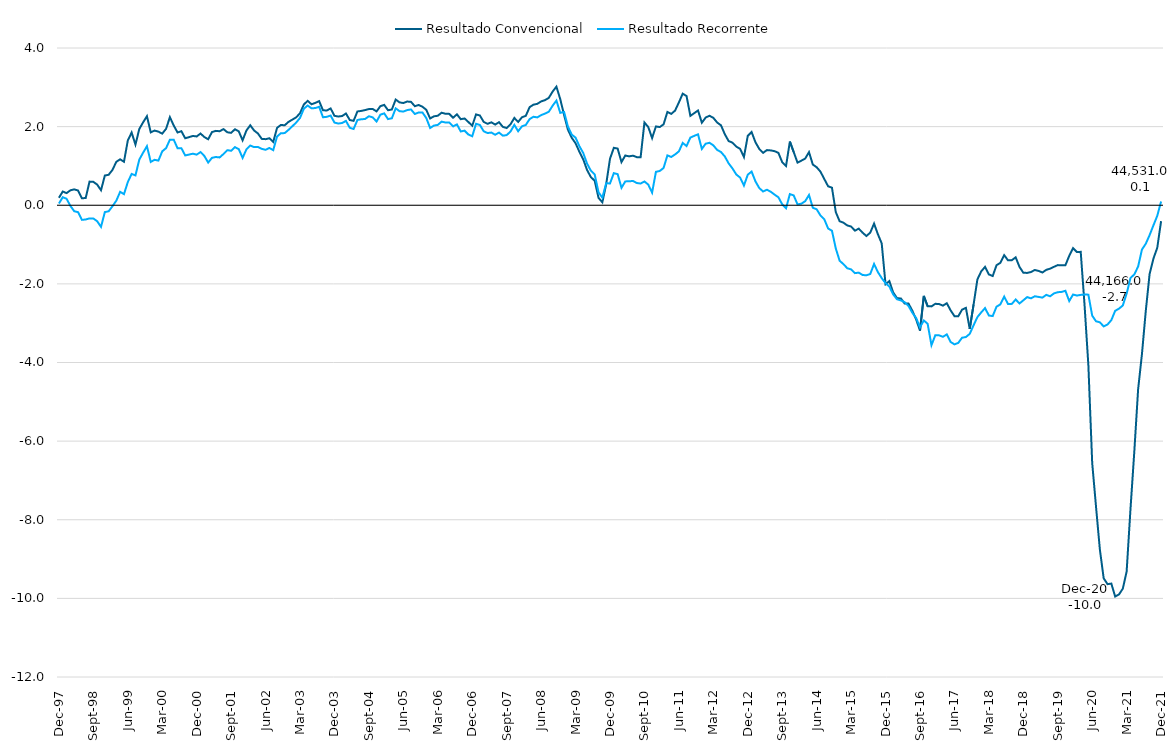
| Category | Resultado Convencional | Resultado Recorrente |
|---|---|---|
| 1997-12-01 | 0.189 | 0.044 |
| 1998-01-01 | 0.349 | 0.204 |
| 1998-02-01 | 0.309 | 0.165 |
| 1998-03-01 | 0.38 | -0.016 |
| 1998-04-01 | 0.404 | -0.152 |
| 1998-05-01 | 0.376 | -0.176 |
| 1998-06-01 | 0.177 | -0.372 |
| 1998-07-01 | 0.184 | -0.362 |
| 1998-08-01 | 0.601 | -0.334 |
| 1998-09-01 | 0.595 | -0.337 |
| 1998-10-01 | 0.525 | -0.407 |
| 1998-11-01 | 0.382 | -0.55 |
| 1998-12-01 | 0.756 | -0.174 |
| 1999-01-01 | 0.776 | -0.153 |
| 1999-02-01 | 0.9 | -0.024 |
| 1999-03-01 | 1.105 | 0.116 |
| 1999-04-01 | 1.168 | 0.341 |
| 1999-05-01 | 1.106 | 0.282 |
| 1999-06-01 | 1.646 | 0.589 |
| 1999-07-01 | 1.85 | 0.797 |
| 1999-08-01 | 1.542 | 0.759 |
| 1999-09-01 | 1.939 | 1.16 |
| 1999-10-01 | 2.109 | 1.337 |
| 1999-11-01 | 2.265 | 1.502 |
| 1999-12-01 | 1.854 | 1.102 |
| 2000-01-01 | 1.9 | 1.156 |
| 2000-02-01 | 1.873 | 1.136 |
| 2000-03-01 | 1.822 | 1.372 |
| 2000-04-01 | 1.944 | 1.453 |
| 2000-05-01 | 2.241 | 1.667 |
| 2000-06-01 | 2.029 | 1.668 |
| 2000-07-01 | 1.85 | 1.45 |
| 2000-08-01 | 1.884 | 1.452 |
| 2000-09-01 | 1.704 | 1.267 |
| 2000-10-01 | 1.732 | 1.289 |
| 2000-11-01 | 1.763 | 1.312 |
| 2000-12-01 | 1.75 | 1.288 |
| 2001-01-01 | 1.824 | 1.352 |
| 2001-02-01 | 1.735 | 1.255 |
| 2001-03-01 | 1.678 | 1.086 |
| 2001-04-01 | 1.862 | 1.206 |
| 2001-05-01 | 1.892 | 1.227 |
| 2001-06-01 | 1.883 | 1.216 |
| 2001-07-01 | 1.937 | 1.303 |
| 2001-08-01 | 1.856 | 1.401 |
| 2001-09-01 | 1.842 | 1.386 |
| 2001-10-01 | 1.933 | 1.478 |
| 2001-11-01 | 1.879 | 1.426 |
| 2001-12-01 | 1.652 | 1.203 |
| 2002-01-01 | 1.902 | 1.422 |
| 2002-02-01 | 2.034 | 1.519 |
| 2002-03-01 | 1.902 | 1.479 |
| 2002-04-01 | 1.826 | 1.482 |
| 2002-05-01 | 1.688 | 1.434 |
| 2002-06-01 | 1.681 | 1.411 |
| 2002-07-01 | 1.704 | 1.457 |
| 2002-08-01 | 1.611 | 1.401 |
| 2002-09-01 | 1.968 | 1.749 |
| 2002-10-01 | 2.043 | 1.831 |
| 2002-11-01 | 2.034 | 1.836 |
| 2002-12-01 | 2.121 | 1.918 |
| 2003-01-01 | 2.178 | 2.01 |
| 2003-02-01 | 2.236 | 2.104 |
| 2003-03-01 | 2.342 | 2.221 |
| 2003-04-01 | 2.563 | 2.455 |
| 2003-05-01 | 2.656 | 2.536 |
| 2003-06-01 | 2.569 | 2.465 |
| 2003-07-01 | 2.604 | 2.473 |
| 2003-08-01 | 2.649 | 2.505 |
| 2003-09-01 | 2.416 | 2.239 |
| 2003-10-01 | 2.411 | 2.249 |
| 2003-11-01 | 2.463 | 2.281 |
| 2003-12-01 | 2.275 | 2.104 |
| 2004-01-01 | 2.257 | 2.078 |
| 2004-02-01 | 2.269 | 2.092 |
| 2004-03-01 | 2.335 | 2.146 |
| 2004-04-01 | 2.168 | 1.971 |
| 2004-05-01 | 2.147 | 1.94 |
| 2004-06-01 | 2.386 | 2.169 |
| 2004-07-01 | 2.399 | 2.187 |
| 2004-08-01 | 2.421 | 2.194 |
| 2004-09-01 | 2.447 | 2.264 |
| 2004-10-01 | 2.448 | 2.235 |
| 2004-11-01 | 2.387 | 2.13 |
| 2004-12-01 | 2.52 | 2.304 |
| 2005-01-01 | 2.553 | 2.337 |
| 2005-02-01 | 2.416 | 2.192 |
| 2005-03-01 | 2.436 | 2.213 |
| 2005-04-01 | 2.689 | 2.464 |
| 2005-05-01 | 2.617 | 2.394 |
| 2005-06-01 | 2.6 | 2.382 |
| 2005-07-01 | 2.638 | 2.421 |
| 2005-08-01 | 2.63 | 2.437 |
| 2005-09-01 | 2.52 | 2.322 |
| 2005-10-01 | 2.55 | 2.36 |
| 2005-11-01 | 2.506 | 2.359 |
| 2005-12-01 | 2.427 | 2.217 |
| 2006-01-01 | 2.207 | 1.965 |
| 2006-02-01 | 2.262 | 2.027 |
| 2006-03-01 | 2.277 | 2.044 |
| 2006-04-01 | 2.354 | 2.127 |
| 2006-05-01 | 2.327 | 2.104 |
| 2006-06-01 | 2.324 | 2.103 |
| 2006-07-01 | 2.227 | 2.005 |
| 2006-08-01 | 2.313 | 2.057 |
| 2006-09-01 | 2.189 | 1.877 |
| 2006-10-01 | 2.207 | 1.898 |
| 2006-11-01 | 2.117 | 1.799 |
| 2006-12-01 | 2.023 | 1.756 |
| 2007-01-01 | 2.311 | 2.072 |
| 2007-02-01 | 2.283 | 2.042 |
| 2007-03-01 | 2.12 | 1.882 |
| 2007-04-01 | 2.071 | 1.837 |
| 2007-05-01 | 2.11 | 1.849 |
| 2007-06-01 | 2.052 | 1.793 |
| 2007-07-01 | 2.113 | 1.849 |
| 2007-08-01 | 1.993 | 1.77 |
| 2007-09-01 | 1.964 | 1.784 |
| 2007-10-01 | 2.058 | 1.875 |
| 2007-11-01 | 2.22 | 2.044 |
| 2007-12-01 | 2.119 | 1.883 |
| 2008-01-01 | 2.238 | 2.008 |
| 2008-02-01 | 2.275 | 2.043 |
| 2008-03-01 | 2.496 | 2.192 |
| 2008-04-01 | 2.559 | 2.25 |
| 2008-05-01 | 2.579 | 2.234 |
| 2008-06-01 | 2.641 | 2.293 |
| 2008-07-01 | 2.674 | 2.331 |
| 2008-08-01 | 2.73 | 2.378 |
| 2008-09-01 | 2.891 | 2.531 |
| 2008-10-01 | 3.017 | 2.662 |
| 2008-11-01 | 2.7 | 2.351 |
| 2008-12-01 | 2.297 | 2.374 |
| 2009-01-01 | 1.924 | 2.003 |
| 2009-02-01 | 1.715 | 1.797 |
| 2009-03-01 | 1.577 | 1.72 |
| 2009-04-01 | 1.361 | 1.503 |
| 2009-05-01 | 1.169 | 1.33 |
| 2009-06-01 | 0.897 | 1.061 |
| 2009-07-01 | 0.716 | 0.879 |
| 2009-08-01 | 0.623 | 0.785 |
| 2009-09-01 | 0.188 | 0.329 |
| 2009-10-01 | 0.075 | 0.194 |
| 2009-11-01 | 0.533 | 0.559 |
| 2009-12-01 | 1.183 | 0.555 |
| 2010-01-01 | 1.461 | 0.817 |
| 2010-02-01 | 1.441 | 0.791 |
| 2010-03-01 | 1.097 | 0.444 |
| 2010-04-01 | 1.266 | 0.607 |
| 2010-05-01 | 1.243 | 0.609 |
| 2010-06-01 | 1.262 | 0.619 |
| 2010-07-01 | 1.224 | 0.565 |
| 2010-08-01 | 1.22 | 0.553 |
| 2010-09-01 | 2.105 | 0.604 |
| 2010-10-01 | 1.989 | 0.525 |
| 2010-11-01 | 1.709 | 0.322 |
| 2010-12-01 | 2.004 | 0.85 |
| 2011-01-01 | 1.989 | 0.871 |
| 2011-02-01 | 2.058 | 0.948 |
| 2011-03-01 | 2.373 | 1.268 |
| 2011-04-01 | 2.324 | 1.228 |
| 2011-05-01 | 2.407 | 1.292 |
| 2011-06-01 | 2.615 | 1.37 |
| 2011-07-01 | 2.838 | 1.585 |
| 2011-08-01 | 2.779 | 1.506 |
| 2011-09-01 | 2.274 | 1.721 |
| 2011-10-01 | 2.342 | 1.765 |
| 2011-11-01 | 2.41 | 1.804 |
| 2011-12-01 | 2.1 | 1.433 |
| 2012-01-01 | 2.231 | 1.566 |
| 2012-02-01 | 2.277 | 1.588 |
| 2012-03-01 | 2.223 | 1.523 |
| 2012-04-01 | 2.105 | 1.408 |
| 2012-05-01 | 2.033 | 1.353 |
| 2012-06-01 | 1.807 | 1.242 |
| 2012-07-01 | 1.632 | 1.066 |
| 2012-08-01 | 1.592 | 0.937 |
| 2012-09-01 | 1.491 | 0.783 |
| 2012-10-01 | 1.435 | 0.704 |
| 2012-11-01 | 1.227 | 0.501 |
| 2012-12-01 | 1.765 | 0.777 |
| 2013-01-01 | 1.862 | 0.857 |
| 2013-02-01 | 1.604 | 0.609 |
| 2013-03-01 | 1.433 | 0.438 |
| 2013-04-01 | 1.332 | 0.35 |
| 2013-05-01 | 1.403 | 0.394 |
| 2013-06-01 | 1.395 | 0.344 |
| 2013-07-01 | 1.376 | 0.271 |
| 2013-08-01 | 1.333 | 0.203 |
| 2013-09-01 | 1.095 | 0.024 |
| 2013-10-01 | 1 | -0.076 |
| 2013-11-01 | 1.62 | 0.284 |
| 2013-12-01 | 1.353 | 0.25 |
| 2014-01-01 | 1.084 | 0.023 |
| 2014-02-01 | 1.135 | 0.04 |
| 2014-03-01 | 1.187 | 0.103 |
| 2014-04-01 | 1.351 | 0.26 |
| 2014-05-01 | 1.035 | -0.063 |
| 2014-06-01 | 0.967 | -0.103 |
| 2014-07-01 | 0.853 | -0.261 |
| 2014-08-01 | 0.666 | -0.359 |
| 2014-09-01 | 0.482 | -0.591 |
| 2014-10-01 | 0.446 | -0.65 |
| 2014-11-01 | -0.175 | -1.1 |
| 2014-12-01 | -0.406 | -1.412 |
| 2015-01-01 | -0.444 | -1.498 |
| 2015-02-01 | -0.514 | -1.603 |
| 2015-03-01 | -0.541 | -1.631 |
| 2015-04-01 | -0.646 | -1.727 |
| 2015-05-01 | -0.595 | -1.714 |
| 2015-06-01 | -0.698 | -1.774 |
| 2015-07-01 | -0.782 | -1.782 |
| 2015-08-01 | -0.697 | -1.75 |
| 2015-09-01 | -0.467 | -1.494 |
| 2015-10-01 | -0.737 | -1.7 |
| 2015-11-01 | -0.971 | -1.853 |
| 2015-12-01 | -2.01 | -1.982 |
| 2016-01-01 | -1.929 | -2.069 |
| 2016-02-01 | -2.22 | -2.268 |
| 2016-03-01 | -2.363 | -2.392 |
| 2016-04-01 | -2.372 | -2.42 |
| 2016-05-01 | -2.501 | -2.465 |
| 2016-06-01 | -2.502 | -2.562 |
| 2016-07-01 | -2.683 | -2.735 |
| 2016-08-01 | -2.907 | -2.868 |
| 2016-09-01 | -3.187 | -3.106 |
| 2016-10-01 | -2.306 | -2.931 |
| 2016-11-01 | -2.57 | -3.015 |
| 2016-12-01 | -2.572 | -3.56 |
| 2017-01-01 | -2.507 | -3.308 |
| 2017-02-01 | -2.513 | -3.31 |
| 2017-03-01 | -2.554 | -3.346 |
| 2017-04-01 | -2.492 | -3.285 |
| 2017-05-01 | -2.672 | -3.477 |
| 2017-06-01 | -2.821 | -3.539 |
| 2017-07-01 | -2.824 | -3.501 |
| 2017-08-01 | -2.655 | -3.37 |
| 2017-09-01 | -2.61 | -3.352 |
| 2017-10-01 | -3.147 | -3.271 |
| 2017-11-01 | -2.528 | -3.055 |
| 2017-12-01 | -1.887 | -2.845 |
| 2018-01-01 | -1.682 | -2.726 |
| 2018-02-01 | -1.568 | -2.616 |
| 2018-03-01 | -1.76 | -2.805 |
| 2018-04-01 | -1.801 | -2.819 |
| 2018-05-01 | -1.525 | -2.58 |
| 2018-06-01 | -1.465 | -2.522 |
| 2018-07-01 | -1.27 | -2.322 |
| 2018-08-01 | -1.401 | -2.513 |
| 2018-09-01 | -1.397 | -2.509 |
| 2018-10-01 | -1.325 | -2.398 |
| 2018-11-01 | -1.569 | -2.498 |
| 2018-12-01 | -1.716 | -2.419 |
| 2019-01-01 | -1.721 | -2.336 |
| 2019-02-01 | -1.698 | -2.368 |
| 2019-03-01 | -1.647 | -2.315 |
| 2019-04-01 | -1.671 | -2.332 |
| 2019-05-01 | -1.71 | -2.349 |
| 2019-06-01 | -1.643 | -2.279 |
| 2019-07-01 | -1.613 | -2.316 |
| 2019-08-01 | -1.567 | -2.243 |
| 2019-09-01 | -1.523 | -2.212 |
| 2019-10-01 | -1.526 | -2.204 |
| 2019-11-01 | -1.525 | -2.176 |
| 2019-12-01 | -1.287 | -2.437 |
| 2020-01-01 | -1.091 | -2.271 |
| 2020-02-01 | -1.189 | -2.297 |
| 2020-03-01 | -1.186 | -2.28 |
| 2020-04-01 | -2.536 | -2.269 |
| 2020-05-01 | -4.071 | -2.274 |
| 2020-06-01 | -6.556 | -2.808 |
| 2020-07-01 | -7.67 | -2.952 |
| 2020-08-01 | -8.753 | -2.977 |
| 2020-09-01 | -9.489 | -3.082 |
| 2020-10-01 | -9.638 | -3.033 |
| 2020-11-01 | -9.624 | -2.922 |
| 2020-12-01 | -9.953 | -2.685 |
| 2021-01-01 | -9.899 | -2.63 |
| 2021-02-01 | -9.753 | -2.55 |
| 2021-03-01 | -9.316 | -2.247 |
| 2021-04-01 | -7.732 | -1.851 |
| 2021-05-01 | -6.27 | -1.76 |
| 2021-06-01 | -4.681 | -1.559 |
| 2021-07-01 | -3.785 | -1.127 |
| 2021-08-01 | -2.688 | -0.978 |
| 2021-09-01 | -1.748 | -0.76 |
| 2021-10-01 | -1.357 | -0.51 |
| 2021-11-01 | -1.081 | -0.269 |
| 2021-12-01 | -0.404 | 0.096 |